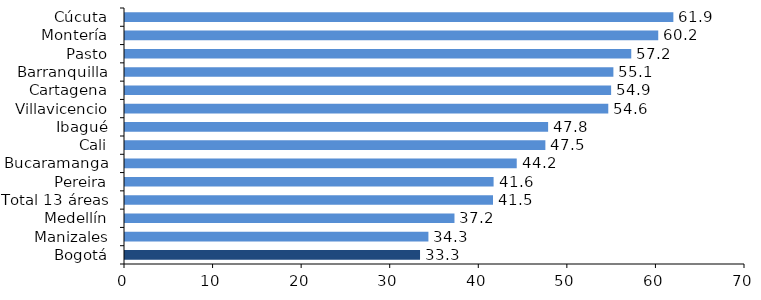
| Category | Series 0 |
|---|---|
| Cúcuta | 61.913 |
| Montería | 60.205 |
| Pasto | 57.159 |
| Barranquilla | 55.141 |
| Cartagena | 54.886 |
| Villavicencio | 54.564 |
| Ibagué | 47.773 |
| Cali | 47.462 |
| Bucaramanga | 44.229 |
| Pereira | 41.615 |
| Total 13 áreas | 41.548 |
| Medellín | 37.199 |
| Manizales | 34.257 |
| Bogotá | 33.31 |